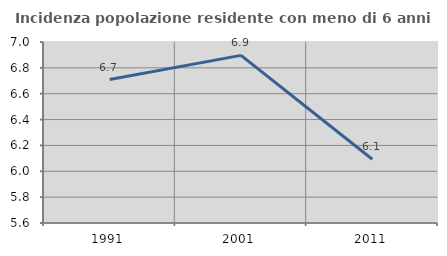
| Category | Incidenza popolazione residente con meno di 6 anni |
|---|---|
| 1991.0 | 6.71 |
| 2001.0 | 6.897 |
| 2011.0 | 6.093 |